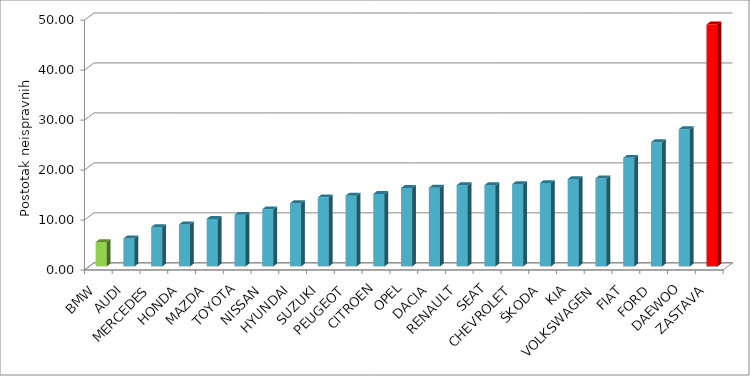
| Category | Series 4 |
|---|---|
| BMW | 4.853 |
| AUDI | 5.6 |
| MERCEDES | 7.858 |
| HONDA | 8.401 |
| MAZDA | 9.515 |
| TOYOTA | 10.335 |
| NISSAN | 11.445 |
| HYUNDAI | 12.65 |
| SUZUKI | 13.834 |
| PEUGEOT | 14.173 |
| CITROEN | 14.507 |
| OPEL | 15.714 |
| DACIA | 15.754 |
| RENAULT | 16.264 |
| SEAT | 16.268 |
| CHEVROLET | 16.459 |
| ŠKODA | 16.697 |
| KIA | 17.485 |
| VOLKSWAGEN | 17.623 |
| FIAT | 21.735 |
| FORD | 24.867 |
| DAEWOO | 27.468 |
| ZASTAVA | 48.432 |